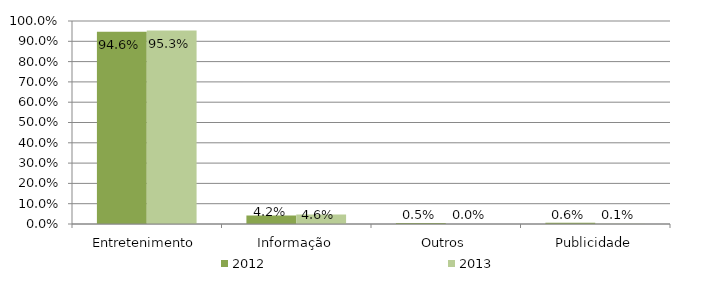
| Category | 2012 | 2013 |
|---|---|---|
| Entretenimento | 0.946 | 0.953 |
| Informação | 0.042 | 0.046 |
| Outros | 0.005 | 0 |
| Publicidade | 0.006 | 0.001 |